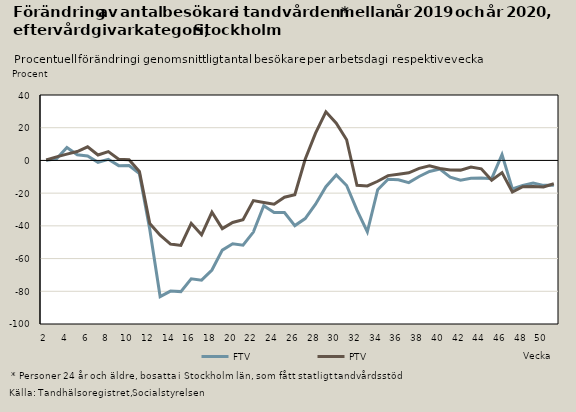
| Category | FTV | PTV |
|---|---|---|
| 2.0 | 0.1 | 0.245 |
| 3.0 | 0.959 | 2.193 |
| 4.0 | 7.925 | 3.861 |
| 5.0 | 3.458 | 5.427 |
| 6.0 | 2.751 | 8.293 |
| 7.0 | -1.118 | 3.323 |
| 8.0 | 0.697 | 5.399 |
| 9.0 | -3.187 | 0.778 |
| 10.0 | -3.151 | 0.382 |
| 11.0 | -8.086 | -6.749 |
| 12.0 | -42.262 | -38.548 |
| 13.0 | -83.241 | -45.681 |
| 14.0 | -79.869 | -51.14 |
| 15.0 | -80.2 | -51.981 |
| 16.0 | -72.335 | -38.466 |
| 17.0 | -73.182 | -45.497 |
| 18.0 | -67.016 | -31.662 |
| 19.0 | -54.838 | -41.695 |
| 20.0 | -50.959 | -37.945 |
| 21.0 | -51.831 | -36.194 |
| 22.0 | -43.79 | -24.561 |
| 23.0 | -27.68 | -25.688 |
| 24.0 | -31.894 | -26.766 |
| 25.0 | -31.826 | -22.46 |
| 26.0 | -39.848 | -20.943 |
| 27.0 | -35.561 | 0.717 |
| 28.0 | -26.775 | 16.705 |
| 29.0 | -16.088 | 29.733 |
| 30.0 | -8.853 | 22.722 |
| 31.0 | -15.324 | 12.639 |
| 32.0 | -30.421 | -15.233 |
| 33.0 | -43.682 | -15.589 |
| 34.0 | -17.927 | -12.742 |
| 35.0 | -11.525 | -9.292 |
| 36.0 | -11.877 | -8.388 |
| 37.0 | -13.545 | -7.575 |
| 38.0 | -9.826 | -4.868 |
| 39.0 | -6.773 | -3.316 |
| 40.0 | -5.315 | -4.95 |
| 41.0 | -10.261 | -5.801 |
| 42.0 | -12.094 | -5.927 |
| 43.0 | -10.892 | -4.013 |
| 44.0 | -10.815 | -5.147 |
| 45.0 | -11.133 | -12.123 |
| 46.0 | 3.581 | -7.478 |
| 47.0 | -17.428 | -19.337 |
| 48.0 | -15.36 | -16.107 |
| 49.0 | -13.841 | -16.009 |
| 50.0 | -15.24 | -16.198 |
| 51.0 | -15.206 | -14.27 |